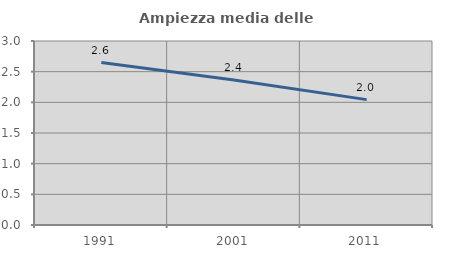
| Category | Ampiezza media delle famiglie |
|---|---|
| 1991.0 | 2.649 |
| 2001.0 | 2.364 |
| 2011.0 | 2.044 |